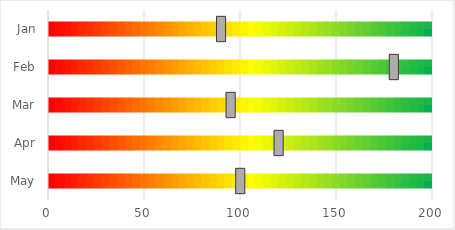
| Category | Spectrum |
|---|---|
| Jan | 200 |
| Feb | 200 |
| Mar | 200 |
| Apr | 200 |
| May | 200 |